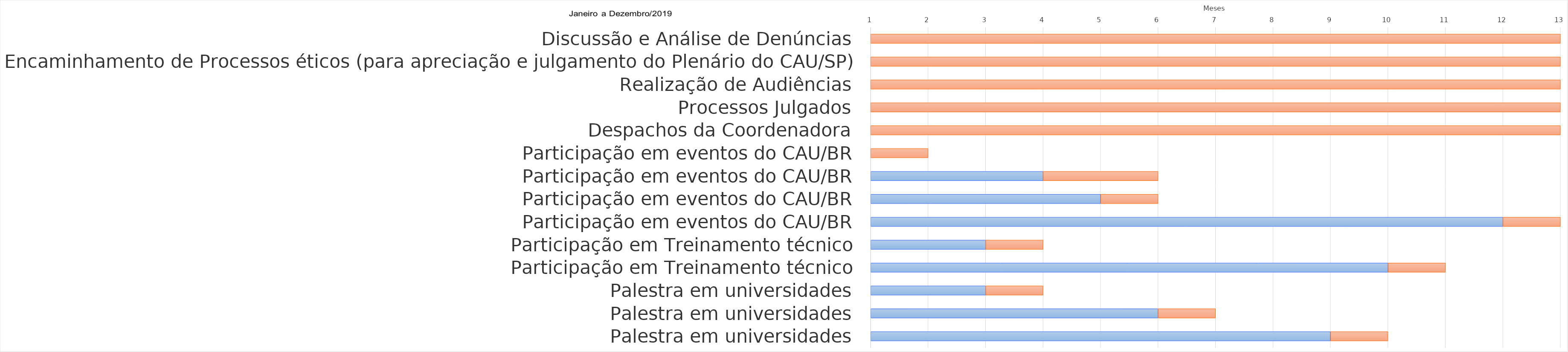
| Category | Início | Duração |
|---|---|---|
| Discussão e Análise de Denúncias | 1 | 12 |
| Encaminhamento de Processos éticos (para apreciação e julgamento do Plenário do CAU/SP) | 1 | 12 |
| Realização de Audiências | 1 | 12 |
| Processos Julgados | 1 | 12 |
| Despachos da Coordenadora | 1 | 12 |
| Participação em eventos do CAU/BR | 1 | 1 |
| Participação em eventos do CAU/BR | 4 | 2 |
| Participação em eventos do CAU/BR | 5 | 1 |
| Participação em eventos do CAU/BR | 12 | 1 |
| Participação em Treinamento técnico | 3 | 1 |
| Participação em Treinamento técnico | 10 | 1 |
| Palestra em universidades | 3 | 1 |
| Palestra em universidades | 6 | 1 |
| Palestra em universidades | 9 | 1 |